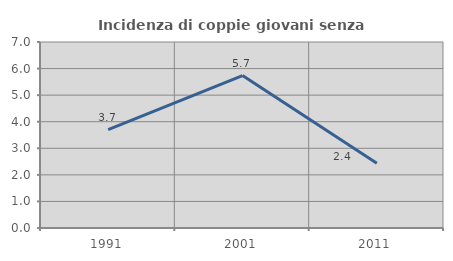
| Category | Incidenza di coppie giovani senza figli |
|---|---|
| 1991.0 | 3.704 |
| 2001.0 | 5.738 |
| 2011.0 | 2.439 |